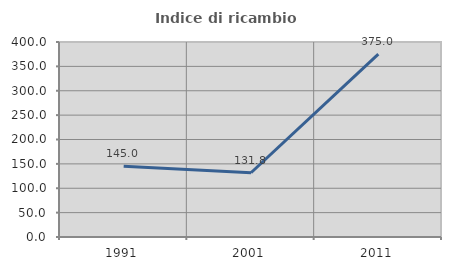
| Category | Indice di ricambio occupazionale  |
|---|---|
| 1991.0 | 145 |
| 2001.0 | 131.818 |
| 2011.0 | 375 |